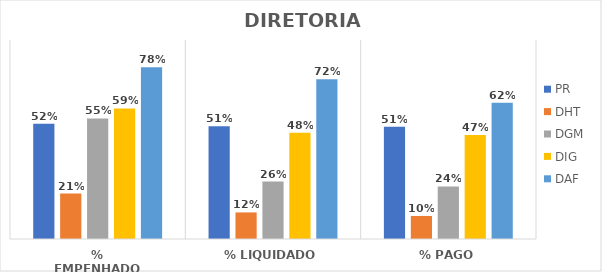
| Category | PR | DHT | DGM | DIG | DAF |
|---|---|---|---|---|---|
| % EMPENHADO | 0.521 | 0.205 | 0.545 | 0.591 | 0.777 |
| % LIQUIDADO | 0.51 | 0.12 | 0.26 | 0.48 | 0.722 |
| % PAGO | 0.508 | 0.104 | 0.238 | 0.471 | 0.616 |